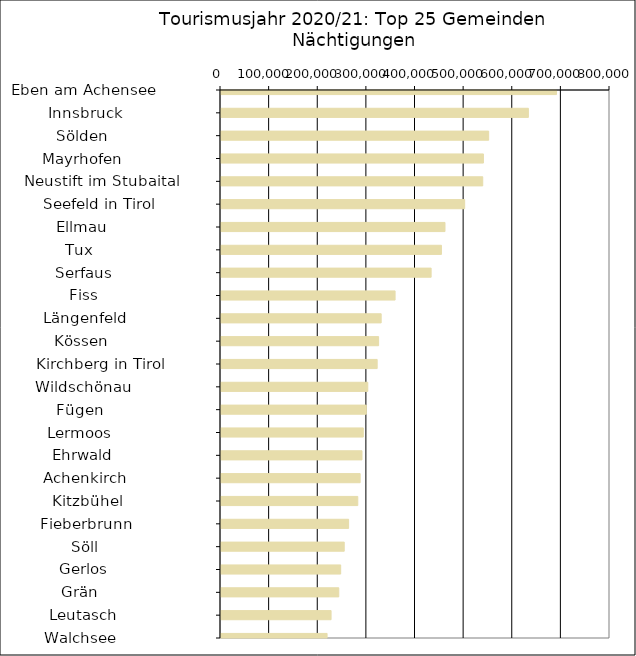
| Category | Series 0 |
|---|---|
|   Eben am Achensee           | 690067 |
|   Innsbruck                  | 632148 |
|   Sölden                     | 550468 |
|   Mayrhofen                  | 539664 |
|   Neustift im Stubaital      | 538278 |
|   Seefeld in Tirol           | 501103 |
|   Ellmau                     | 460667 |
|   Tux                        | 453320 |
|   Serfaus                    | 432132 |
|   Fiss                       | 358007 |
|   Längenfeld                 | 329398 |
|   Kössen                     | 324130 |
|   Kirchberg in Tirol         | 321171 |
|   Wildschönau                | 301858 |
|   Fügen                      | 298813 |
|   Lermoos                    | 292705 |
|   Ehrwald                    | 289957 |
|   Achenkirch                 | 286179 |
|   Kitzbühel                  | 281319 |
|   Fieberbrunn                | 262433 |
|   Söll                       | 253435 |
|   Gerlos                     | 246141 |
|   Grän                       | 242212 |
|   Leutasch                   | 226351 |
|   Walchsee                   | 218157 |